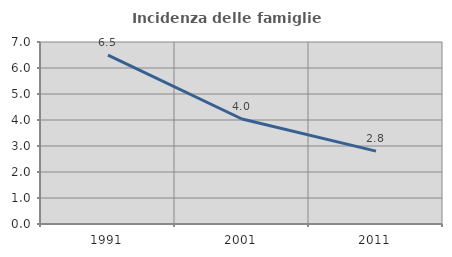
| Category | Incidenza delle famiglie numerose |
|---|---|
| 1991.0 | 6.499 |
| 2001.0 | 4.038 |
| 2011.0 | 2.804 |